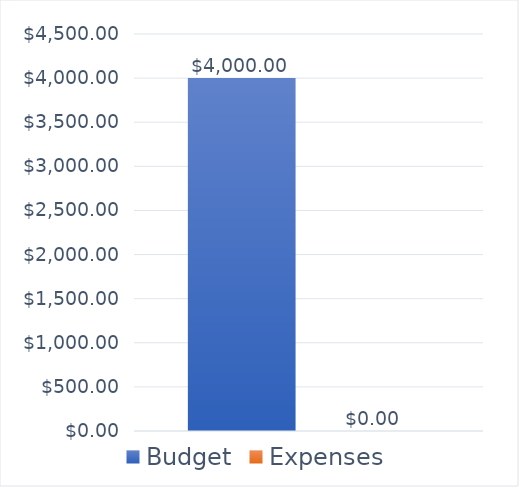
| Category | Budget | Expenses |
|---|---|---|
| 0 | 4000 | 0 |